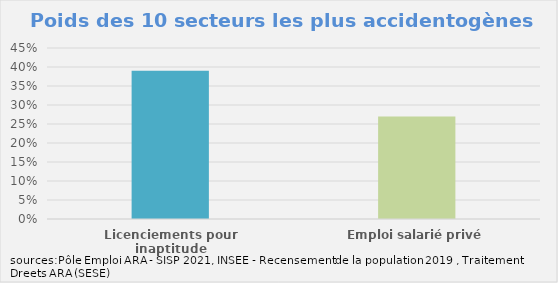
| Category | Series 0 |
|---|---|
| Licenciements pour inaptitude | 0.39 |
| Emploi salarié privé | 0.27 |